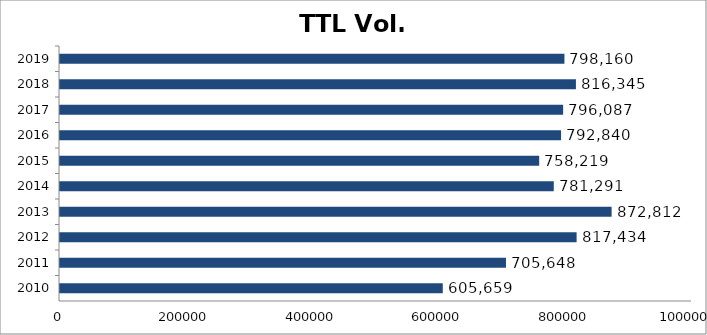
| Category | TTL Vol. TEU |
|---|---|
| 2010-01-01 | 605659 |
| 2011-01-01 | 705648 |
| 2012-01-01 | 817434 |
| 2013-01-01 | 872812 |
| 2014-01-01 | 781291 |
| 2015-01-01 | 758219 |
| 2016-01-01 | 792840 |
| 2017-01-01 | 796087 |
| 2018-01-01 | 816345 |
| 2019-01-01 | 798160 |